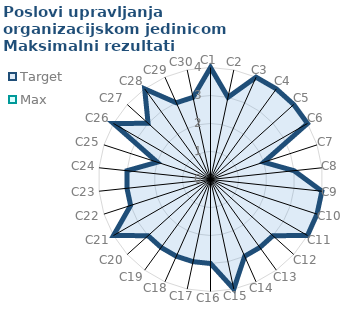
| Category | Target | Max |
|---|---|---|
| C1 | 4 | 0 |
| C2 | 3 | 0 |
| C3 | 4 | 0 |
| C4 | 4 | 0 |
| C5 | 4 | 0 |
| C6 | 4 | 0 |
| C7 | 2 | 0 |
| C8 | 3 | 0 |
| C9 | 4 | 0 |
| C10 | 4 | 0 |
| C11 | 4 | 0 |
| C12 | 3 | 0 |
| C13 | 3 | 0 |
| C14 | 3 | 0 |
| C15 | 4 | 0 |
| C16 | 3 | 0 |
| C17 | 3 | 0 |
| C18 | 3 | 0 |
| C19 | 3 | 0 |
| C20 | 3 | 0 |
| C21 | 4 | 0 |
| C22 | 3 | 0 |
| C23 | 3 | 0 |
| C24 | 3 | 0 |
| C25 | 2 | 0 |
| C26 | 4 | 0 |
| C27 | 3 | 0 |
| C28 | 4 | 0 |
| C29 | 3 | 0 |
| C30 | 3 | 0 |